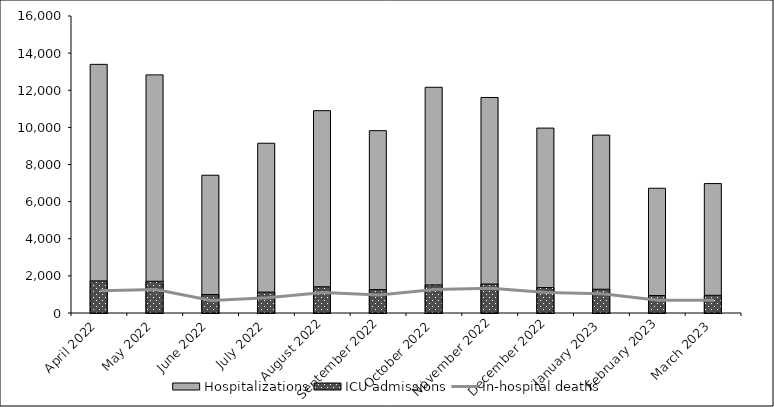
| Category | Hospitalizations | ICU admissions |
|---|---|---|
| April 2022 | 13395 | 1729 |
| May 2022 | 12828 | 1709 |
| June 2022 | 7422 | 996 |
| July 2022 | 9145 | 1125 |
| August 2022 | 10900 | 1413 |
| September 2022 | 9823 | 1261 |
| October 2022 | 12160 | 1513 |
| November 2022 | 11611 | 1563 |
| December 2022 | 9962 | 1368 |
| January 2023 | 9584 | 1281 |
| February 2023 | 6721 | 944 |
| March 2023 | 6973 | 954 |